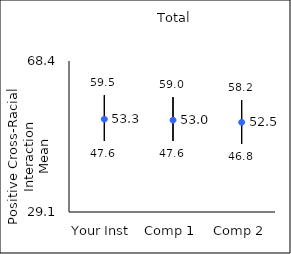
| Category | 25th percentile | 75th percentile | Mean |
|---|---|---|---|
| Your Inst | 47.6 | 59.5 | 53.26 |
| Comp 1 | 47.6 | 59 | 53 |
| Comp 2 | 46.8 | 58.2 | 52.45 |